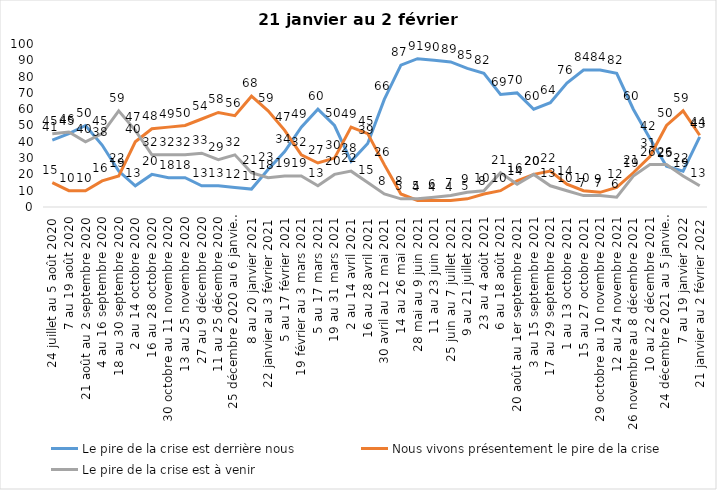
| Category | Le pire de la crise est derrière nous | Nous vivons présentement le pire de la crise | Le pire de la crise est à venir |
|---|---|---|---|
| 24 juillet au 5 août 2020 | 41 | 15 | 45 |
| 7 au 19 août 2020 | 45 | 10 | 46 |
| 21 août au 2 septembre 2020 | 50 | 10 | 40 |
| 4 au 16 septembre 2020 | 38 | 16 | 45 |
| 18 au 30 septembre 2020 | 22 | 19 | 59 |
| 2 au 14 octobre 2020 | 13 | 40 | 47 |
| 16 au 28 octobre 2020 | 20 | 48 | 32 |
| 30 octobre au 11 novembre 2020 | 18 | 49 | 32 |
| 13 au 25 novembre 2020 | 18 | 50 | 32 |
| 27 au 9 décembre 2020 | 13 | 54 | 33 |
| 11 au 25 décembre 2020 | 13 | 58 | 29 |
| 25 décembre 2020 au 6 janvier 2021 | 12 | 56 | 32 |
| 8 au 20 janvier 2021 | 11 | 68 | 21 |
| 22 janvier au 3 février 2021 | 23 | 59 | 18 |
| 5 au 17 février 2021 | 34 | 47 | 19 |
| 19 février au 3 mars 2021 | 49 | 32 | 19 |
| 5 au 17 mars 2021 | 60 | 27 | 13 |
| 19 au 31 mars 2021 | 50 | 30 | 20 |
| 2 au 14 avril 2021 | 28 | 49 | 22 |
| 16 au 28 avril 2021 | 39 | 45 | 15 |
| 30 avril au 12 mai 2021 | 66 | 26 | 8 |
| 14 au 26 mai 2021 | 87 | 8 | 5 |
| 28 mai au 9 juin 2021 | 91 | 4 | 5 |
| 11 au 23 juin 2021 | 90 | 4 | 6 |
| 25 juin au 7 juillet 2021 | 89 | 4 | 7 |
| 9 au 21 juillet 2021 | 85 | 5 | 9 |
| 23 au 4 août 2021 | 82 | 8 | 10 |
| 6 au 18 août 2021 | 69 | 10 | 21 |
| 20 août au 1er septembre 2021 | 70 | 16 | 14 |
| 3 au 15 septembre 2021 | 60 | 20 | 20 |
| 17 au 29 septembre 2021 | 64 | 22 | 13 |
| 1 au 13 octobre 2021 | 76 | 14 | 10 |
| 15 au 27 octobre 2021 | 84 | 10 | 7 |
| 29 octobre au 10 novembre 2021 | 84 | 9 | 7 |
| 12 au 24 novembre 2021 | 82 | 12 | 6 |
| 26 novembre au 8 décembre 2021 | 60 | 21 | 19 |
| 10 au 22 décembre 2021 | 42 | 31 | 26 |
| 24 décembre 2021 au 5 janvier 2022 2022 | 25 | 50 | 26 |
| 7 au 19 janvier 2022 | 22 | 59 | 19 |
| 21 janvier au 2 février 2022 | 43 | 44 | 13 |